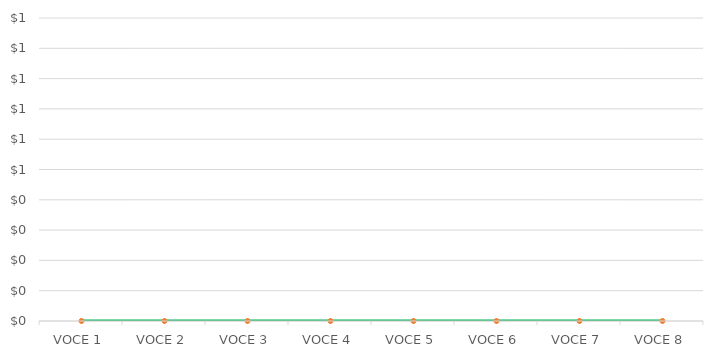
| Category | Series 1 |
|---|---|
| VOCE 1 | 0 |
| VOCE 2 | 0 |
| VOCE 3 | 0 |
| VOCE 4 | 0 |
| VOCE 5 | 0 |
| VOCE 6 | 0 |
| VOCE 7 | 0 |
| VOCE 8 | 0 |